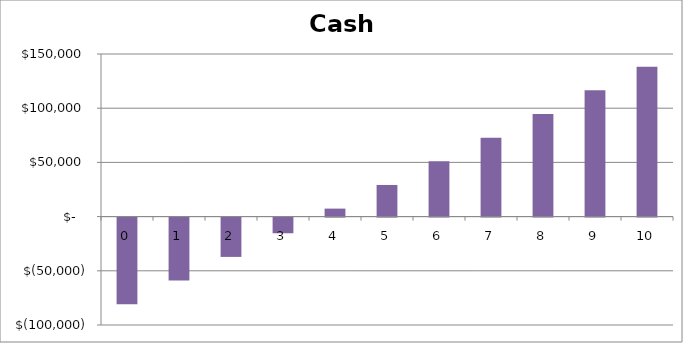
| Category | Cash Balance |
|---|---|
| 0.0 | -79900 |
| 1.0 | -58083.095 |
| 2.0 | -36266.19 |
| 3.0 | -14449.286 |
| 4.0 | 7367.619 |
| 5.0 | 29184.524 |
| 6.0 | 51001.429 |
| 7.0 | 72818.333 |
| 8.0 | 94635.238 |
| 9.0 | 116452.143 |
| 10.0 | 138269.048 |